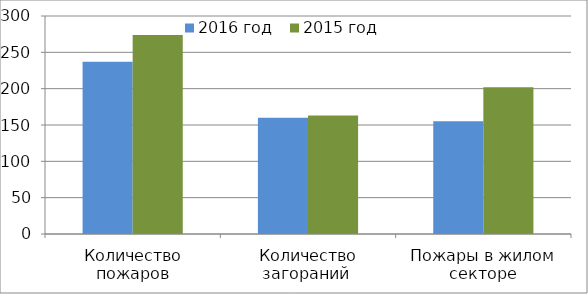
| Category | 2016 год | 2015 год |
|---|---|---|
| Количество пожаров | 237 | 274 |
| Количество загораний  | 160 | 163 |
| Пожары в жилом секторе | 155 | 202 |